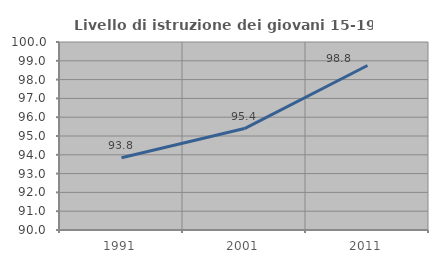
| Category | Livello di istruzione dei giovani 15-19 anni |
|---|---|
| 1991.0 | 93.846 |
| 2001.0 | 95.395 |
| 2011.0 | 98.75 |